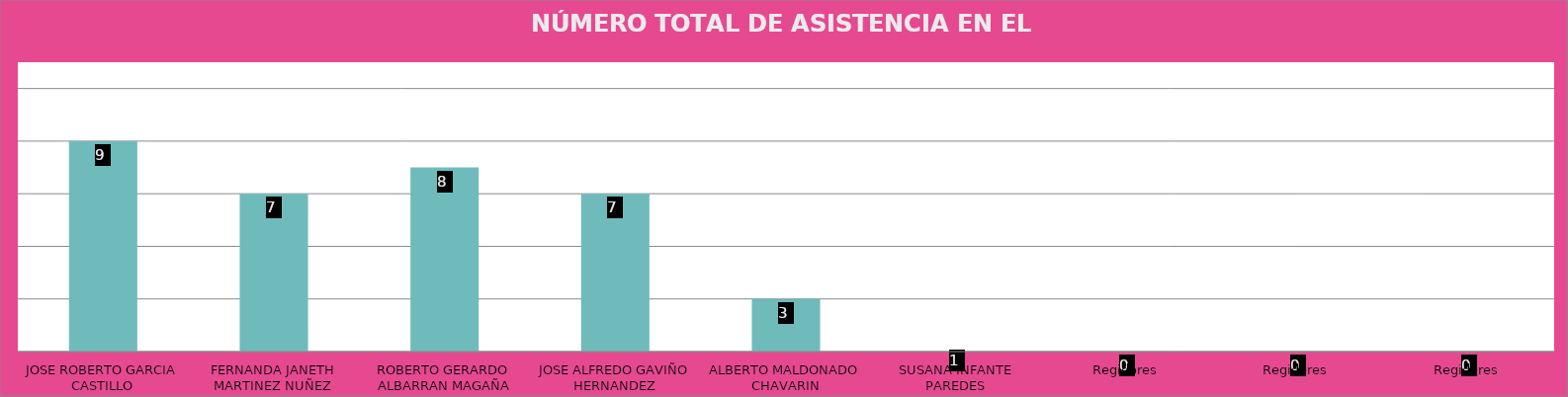
| Category | JOSE ROBERTO GARCIA CASTILLO |
|---|---|
| JOSE ROBERTO GARCIA CASTILLO | 9 |
| FERNANDA JANETH MARTINEZ NUÑEZ | 7 |
| ROBERTO GERARDO ALBARRAN MAGAÑA | 8 |
| JOSE ALFREDO GAVIÑO HERNANDEZ | 7 |
| ALBERTO MALDONADO CHAVARIN | 3 |
| SUSANA INFANTE PAREDES | 1 |
| Regidores | 0 |
| Regidores | 0 |
| Regidores | 0 |